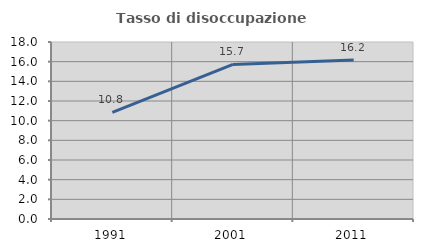
| Category | Tasso di disoccupazione giovanile  |
|---|---|
| 1991.0 | 10.84 |
| 2001.0 | 15.714 |
| 2011.0 | 16.168 |